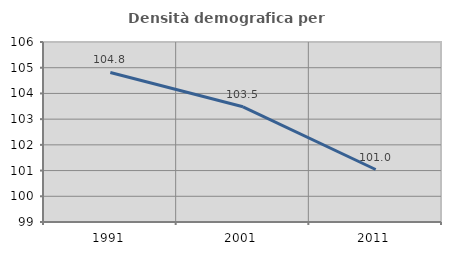
| Category | Densità demografica |
|---|---|
| 1991.0 | 104.814 |
| 2001.0 | 103.481 |
| 2011.0 | 101.041 |